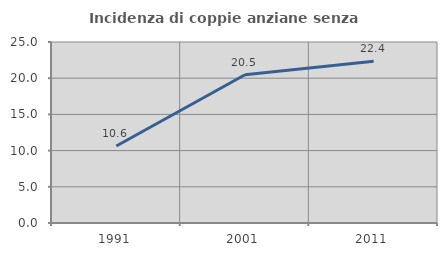
| Category | Incidenza di coppie anziane senza figli  |
|---|---|
| 1991.0 | 10.629 |
| 2001.0 | 20.476 |
| 2011.0 | 22.354 |